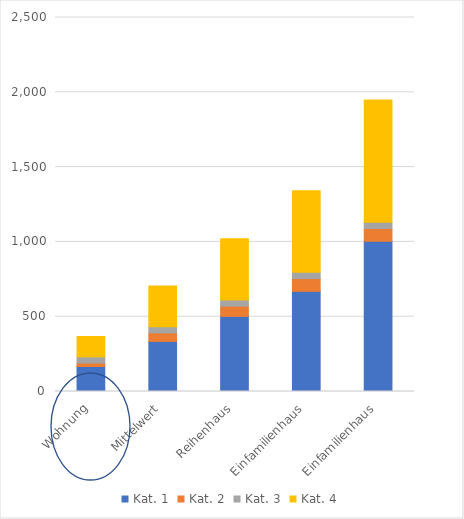
| Category | Kat. 1 | Kat. 2 | Kat. 3 | Kat. 4 |
|---|---|---|---|---|
| Wohnung | 167.4 | 22.8 | 41.4 | 136.245 |
| Mittelwert | 334.8 | 57 | 41.4 | 272.49 |
| Reihenhaus | 502.2 | 68.4 | 41.4 | 408.735 |
| Einfamilienhaus | 669.6 | 85.5 | 41.4 | 544.98 |
| Einfamilienhaus | 1004.4 | 85.5 | 41.4 | 817.47 |